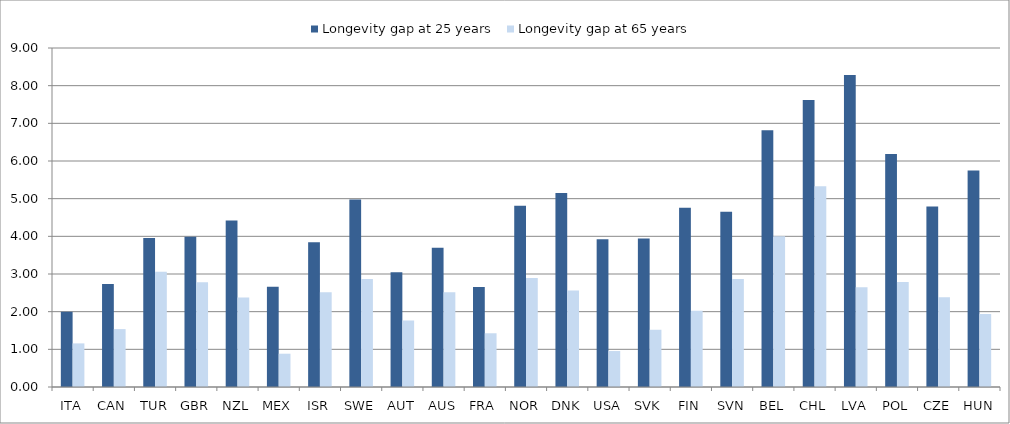
| Category | Longevity gap at 25 years | Longevity gap at 65 years |
|---|---|---|
| ITA | 2 | 1.158 |
| CAN | 2.733 | 1.537 |
| TUR | 3.953 | 3.058 |
| GBR | 3.991 | 2.782 |
| NZL | 4.421 | 2.375 |
| MEX | 2.664 | 0.884 |
| ISR | 3.841 | 2.513 |
| SWE | 4.98 | 2.866 |
| AUT | 3.049 | 1.764 |
| AUS | 3.694 | 2.516 |
| FRA | 2.654 | 1.427 |
| NOR | 4.813 | 2.891 |
| DNK | 5.152 | 2.56 |
| USA | 3.923 | 0.955 |
| SVK | 3.944 | 1.52 |
| FIN | 4.76 | 2.026 |
| SVN | 4.653 | 2.869 |
| BEL | 6.815 | 4.002 |
| CHL | 7.62 | 5.329 |
| LVA | 8.28 | 2.645 |
| POL | 6.189 | 2.787 |
| CZE | 4.79 | 2.382 |
| HUN | 5.745 | 1.94 |